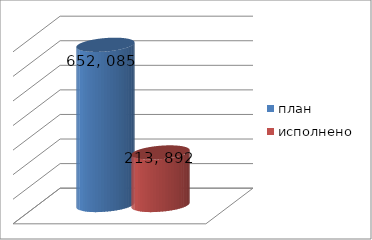
| Category | план | исполнено |
|---|---|---|
| 0 | 652085041.46 | 213892986.53 |